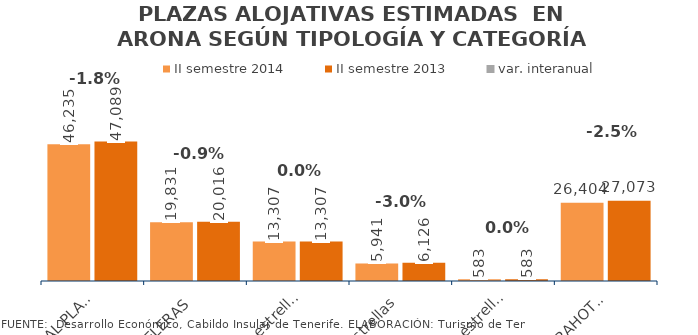
| Category | II semestre 2014 | II semestre 2013 |
|---|---|---|
| TOTAL PLAZAS | 46235 | 47089 |
| HOTELERAS | 19831 | 20016 |
| 5 y 4 estrellas | 13307 | 13307 |
| 3 estrellas | 5941 | 6126 |
| 1 Y 2 estrellas | 583 | 583 |
| EXTRAHOTELERAS | 26404 | 27073 |